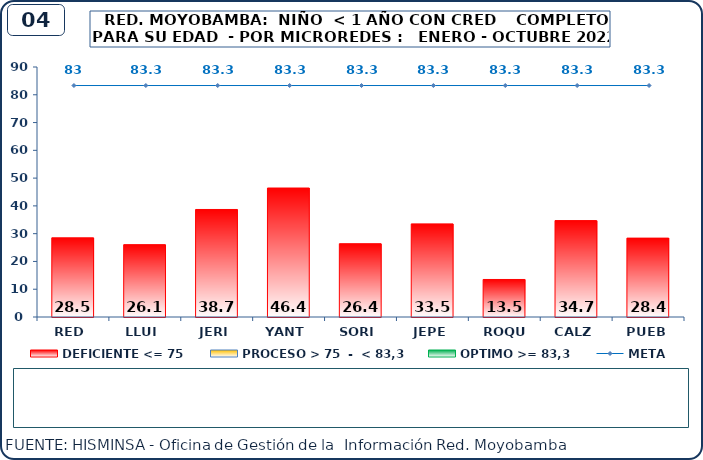
| Category | DEFICIENTE <= 75 | PROCESO > 75  -  < 83,3 | OPTIMO >= 83,3 |
|---|---|---|---|
| RED | 28.53 | 0 | 0 |
| LLUI | 26.06 | 0 | 0 |
| JERI | 38.71 | 0 | 0 |
| YANT | 46.43 | 0 | 0 |
| SORI | 26.4 | 0 | 0 |
| JEPE | 33.52 | 0 | 0 |
| ROQU | 13.51 | 0 | 0 |
| CALZ | 34.72 | 0 | 0 |
| PUEB | 28.4 | 0 | 0 |